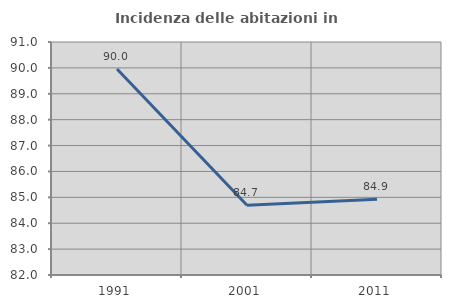
| Category | Incidenza delle abitazioni in proprietà  |
|---|---|
| 1991.0 | 89.958 |
| 2001.0 | 84.695 |
| 2011.0 | 84.927 |